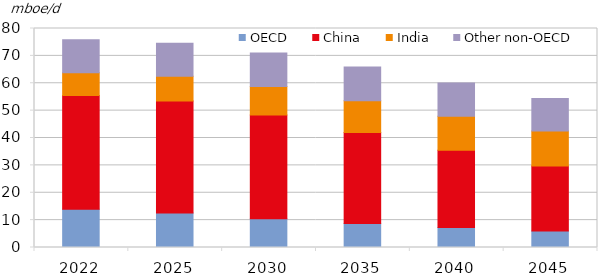
| Category | OECD | China | India | Other non-OECD |
|---|---|---|---|---|
| 2022.0 | 13.962 | 41.607 | 8.306 | 12.05 |
| 2025.0 | 12.648 | 40.9 | 9.027 | 12.048 |
| 2030.0 | 10.538 | 37.849 | 10.396 | 12.273 |
| 2035.0 | 8.808 | 33.21 | 11.6 | 12.273 |
| 2040.0 | 7.293 | 28.207 | 12.45 | 12.098 |
| 2045.0 | 6.015 | 23.747 | 12.795 | 11.831 |